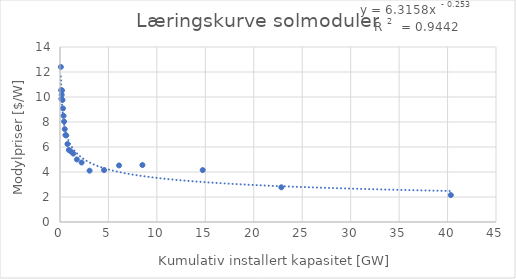
| Category | Modulpris [$/W] |
|---|---|
| 0.089155 | 12.405 |
| 0.113655 | 10.546 |
| 0.1406 | 9.851 |
| 0.17335 | 10.18 |
| 0.21230000000000002 | 10.53 |
| 0.25715 | 9.754 |
| 0.30905 | 9.087 |
| 0.3659 | 8.498 |
| 0.42375 | 8.039 |
| 0.48925 | 7.433 |
| 0.565 | 6.949 |
| 0.6507999999999999 | 6.925 |
| 0.771 | 6.24 |
| 0.9145 | 5.764 |
| 1.103 | 5.657 |
| 1.373 | 5.473 |
| 1.7385 | 5.005 |
| 2.2292056 | 4.758 |
| 3.0519789999999998 | 4.107 |
| 4.548119 | 4.151 |
| 6.093193 | 4.524 |
| 8.506466 | 4.558 |
| 14.729541 | 4.154 |
| 22.844467 | 2.776 |
| 40.33781 | 2.154 |